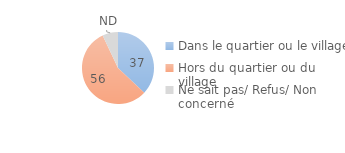
| Category | Series 0 |
|---|---|
| Dans le quartier ou le village | 37 |
| Hors du quartier ou du village | 56 |
| Ne sait pas/ Refus/ Non concerné | 7 |